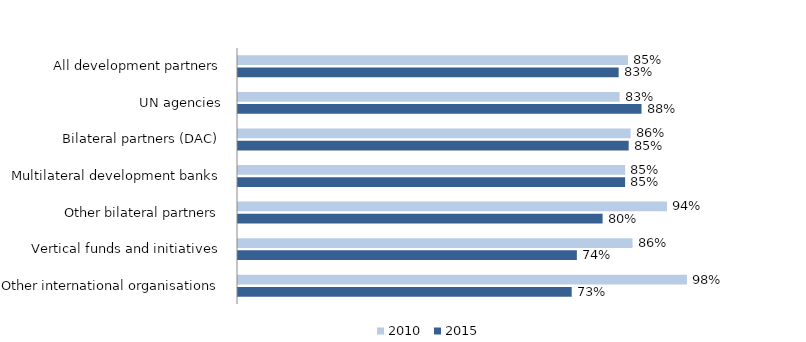
| Category | 2010 | 2015 |
|---|---|---|
| All development partners | 0.852 | 0.832 |
| UN agencies | 0.834 | 0.882 |
| Bilateral partners (DAC) | 0.858 | 0.854 |
| Multilateral development banks | 0.846 | 0.846 |
| Other bilateral partners | 0.938 | 0.797 |
| Vertical funds and initiatives | 0.862 | 0.741 |
| Other international organisations | 0.981 | 0.729 |